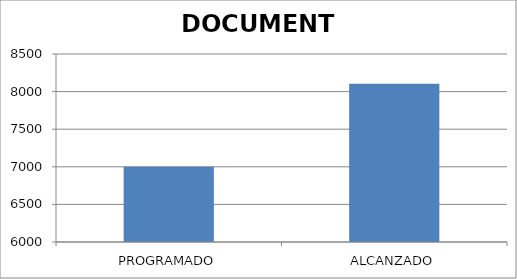
| Category | DOCUMENTO |
|---|---|
| PROGRAMADO | 7000 |
| ALCANZADO | 8106 |